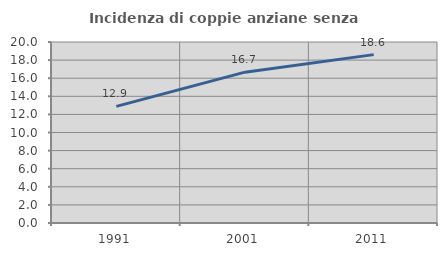
| Category | Incidenza di coppie anziane senza figli  |
|---|---|
| 1991.0 | 12.881 |
| 2001.0 | 16.667 |
| 2011.0 | 18.605 |